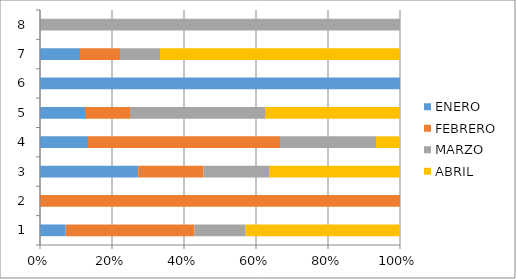
| Category | ENERO | FEBRERO | MARZO | ABRIL |
|---|---|---|---|---|
| 0 | 1 | 5 | 2 | 6 |
| 1 | 0 | 1 | 0 | 0 |
| 2 | 3 | 2 | 2 | 4 |
| 3 | 2 | 8 | 4 | 1 |
| 4 | 1 | 1 | 3 | 3 |
| 5 | 1 | 0 | 0 | 0 |
| 6 | 1 | 1 | 1 | 6 |
| 7 | 0 | 0 | 1 | 0 |